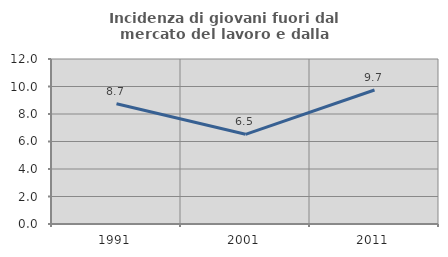
| Category | Incidenza di giovani fuori dal mercato del lavoro e dalla formazione  |
|---|---|
| 1991.0 | 8.746 |
| 2001.0 | 6.522 |
| 2011.0 | 9.743 |